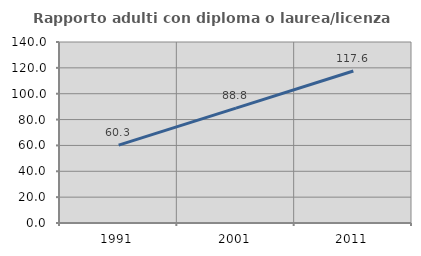
| Category | Rapporto adulti con diploma o laurea/licenza media  |
|---|---|
| 1991.0 | 60.284 |
| 2001.0 | 88.848 |
| 2011.0 | 117.557 |